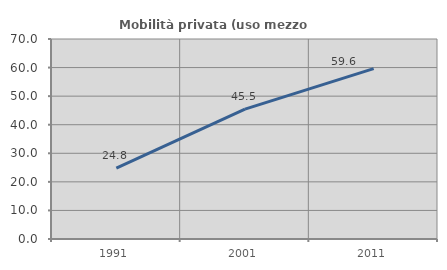
| Category | Mobilità privata (uso mezzo privato) |
|---|---|
| 1991.0 | 24.79 |
| 2001.0 | 45.455 |
| 2011.0 | 59.615 |